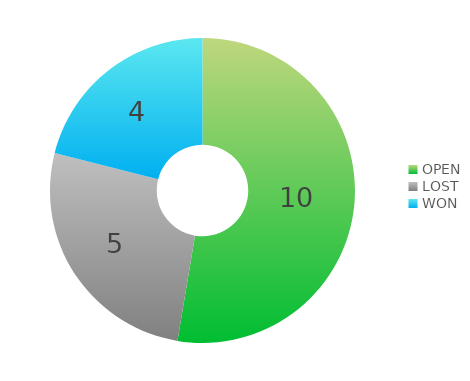
| Category | Series 0 |
|---|---|
| OPEN | 10 |
| LOST | 5 |
| WON | 4 |